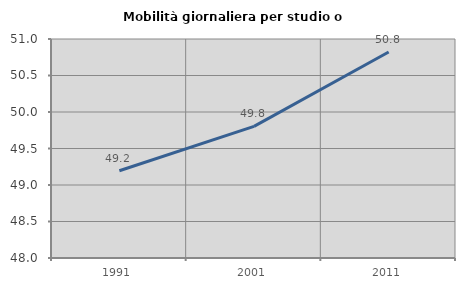
| Category | Mobilità giornaliera per studio o lavoro |
|---|---|
| 1991.0 | 49.195 |
| 2001.0 | 49.802 |
| 2011.0 | 50.821 |